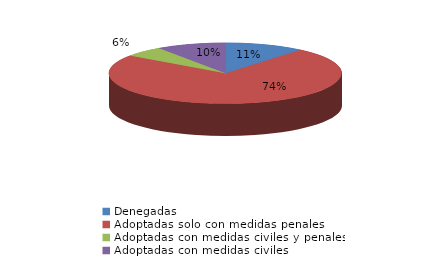
| Category | Series 0 |
|---|---|
| Denegadas | 24 |
| Adoptadas solo con medidas penales | 161 |
| Adoptadas con medidas civiles y penales | 12 |
| Adoptadas con medidas civiles | 21 |